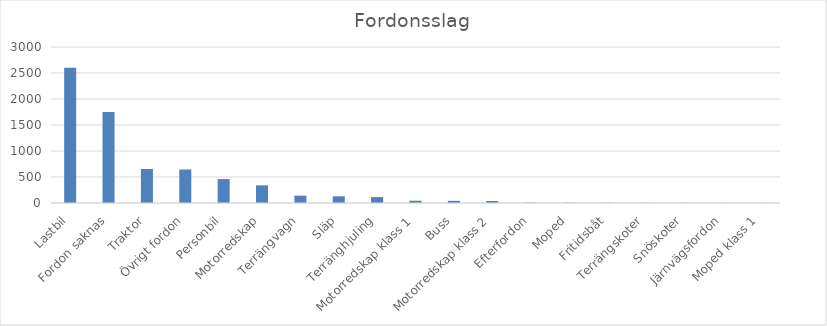
| Category | Summa |
|---|---|
| Lastbil | 2601 |
| Fordon saknas | 1749 |
| Traktor | 654 |
| Övrigt fordon | 644 |
| Personbil | 460 |
| Motorredskap | 339 |
| Terrängvagn | 141 |
| Släp | 129 |
| Terränghjuling | 114 |
| Motorredskap klass 1 | 44 |
| Buss | 42 |
| Motorredskap klass 2 | 38 |
| Efterfordon | 7 |
| Moped | 6 |
| Fritidsbåt | 4 |
| Terrängskoter | 3 |
| Snöskoter | 3 |
| Järnvägsfordon | 1 |
| Moped klass 1 | 1 |